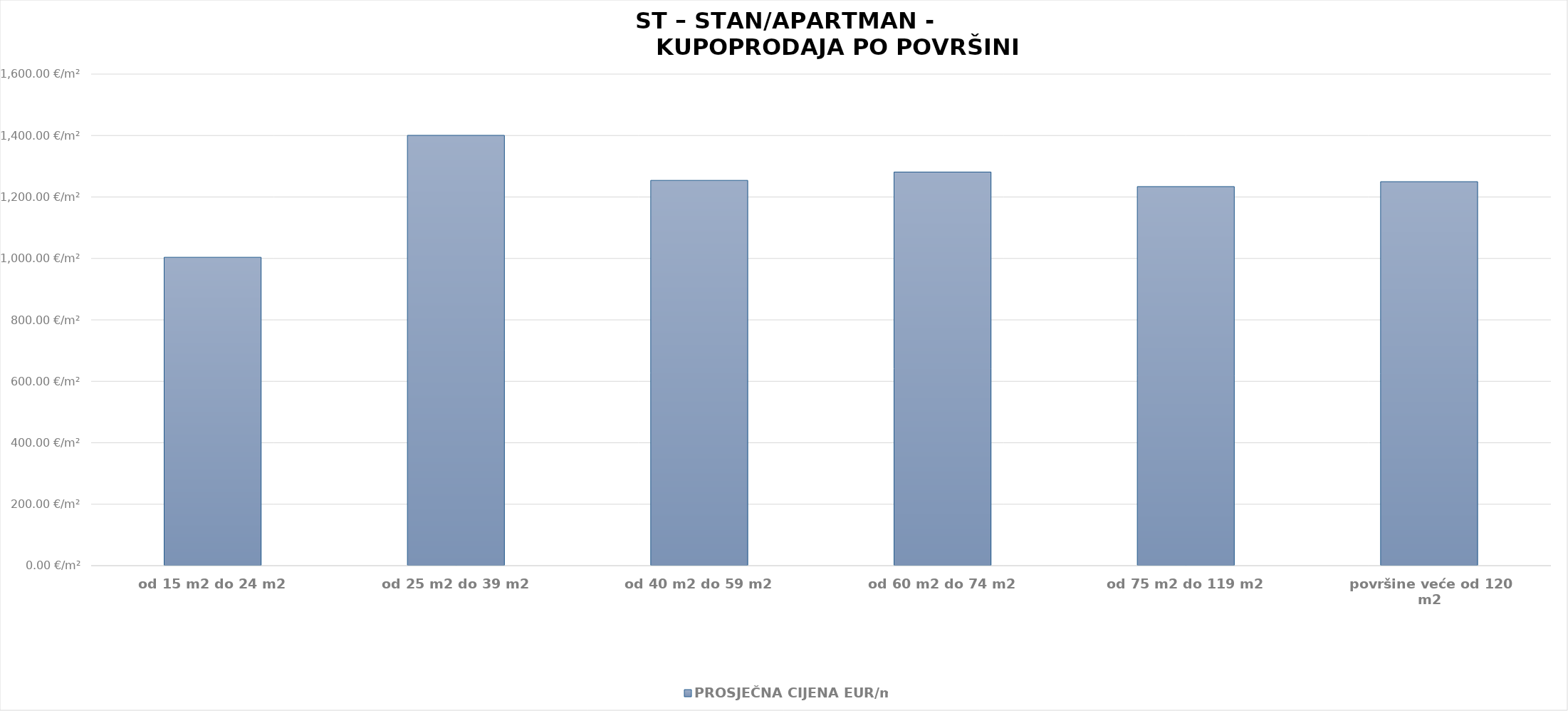
| Category | PROSJEČNA CIJENA EUR/m2 |
|---|---|
| od 15 m2 do 24 m2 | 1902-09-29 16:44:58 |
| od 25 m2 do 39 m2 | 1903-10-31 14:44:27 |
| od 40 m2 do 59 m2 | 1903-06-07 00:53:55 |
| od 60 m2 do 74 m2 | 1903-07-04 04:32:03 |
| od 75 m2 do 119 m2 | 1903-05-17 19:36:02 |
| površine veće od 120 m2 | 1903-06-02 19:56:36 |